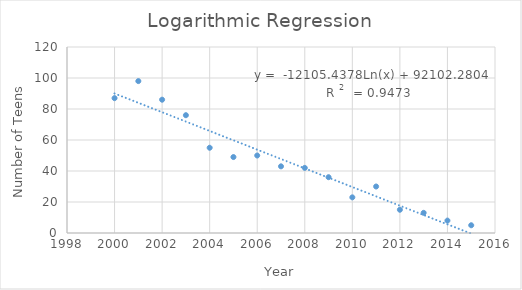
| Category | Number of Teens  |
|---|---|
| 2000.0 | 87 |
| 2001.0 | 98 |
| 2002.0 | 86 |
| 2003.0 | 76 |
| 2004.0 | 55 |
| 2005.0 | 49 |
| 2006.0 | 50 |
| 2007.0 | 43 |
| 2008.0 | 42 |
| 2009.0 | 36 |
| 2010.0 | 23 |
| 2011.0 | 30 |
| 2012.0 | 15 |
| 2013.0 | 13 |
| 2014.0 | 8 |
| 2015.0 | 5 |